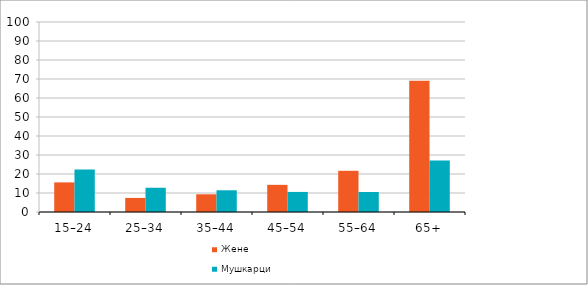
| Category | Жене | Мушкарци |
|---|---|---|
| 15–24 | 15.584 | 22.361 |
| 25–34 | 7.412 | 12.764 |
| 35–44 | 9.326 | 11.43 |
| 45–54 | 14.292 | 10.563 |
| 55–64 | 21.685 | 10.514 |
| 65+ | 69.09 | 27.049 |